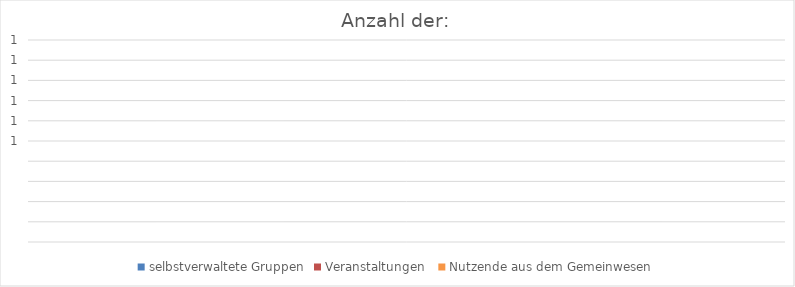
| Category | selbstverwaltete Gruppen | Veranstaltungen  | Nutzende aus dem Gemeinwesen |
|---|---|---|---|
| 0 | 0 | 0 | 0 |